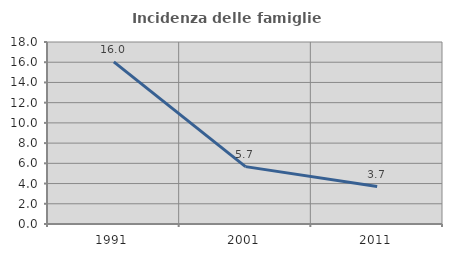
| Category | Incidenza delle famiglie numerose |
|---|---|
| 1991.0 | 16.038 |
| 2001.0 | 5.674 |
| 2011.0 | 3.704 |